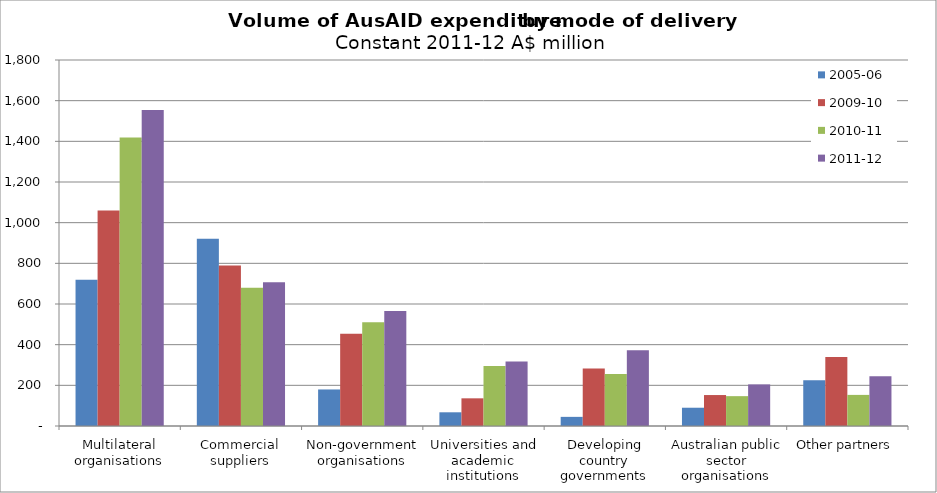
| Category | 2005-06 | 2009-10 | 2010-11 | 2011-12 |
|---|---|---|---|---|
| Multilateral organisations | 718.864 | 1059.385 | 1419.336 | 1554.283 |
| Commercial suppliers | 921.045 | 789.047 | 679.777 | 707.275 |
| Non-government organisations | 179.716 | 453.13 | 509.66 | 565.791 |
| Universities and academic institutions | 67.394 | 136.109 | 295.29 | 317.072 |
| Developing country governments | 44.929 | 282.468 | 255.898 | 372.307 |
| Australian public sector organisations | 89.858 | 152.254 | 146.812 | 204.648 |
| Other partners | 224.645 | 339.287 | 152.97 | 244.517 |